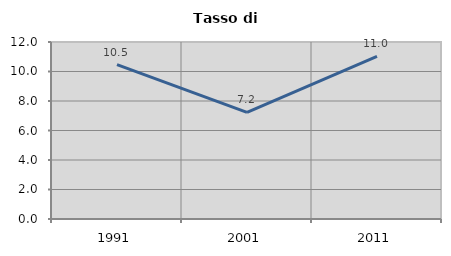
| Category | Tasso di disoccupazione   |
|---|---|
| 1991.0 | 10.465 |
| 2001.0 | 7.234 |
| 2011.0 | 11.033 |